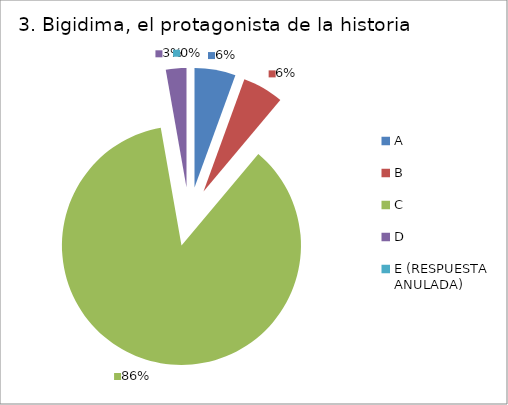
| Category | CANTIDAD DE RESPUESTAS PREGUNTA (3) | PORCENTAJE |
|---|---|---|
| A | 2 | 0.056 |
| B | 2 | 0.056 |
| C | 31 | 0.861 |
| D | 1 | 0.028 |
| E (RESPUESTA ANULADA) | 0 | 0 |